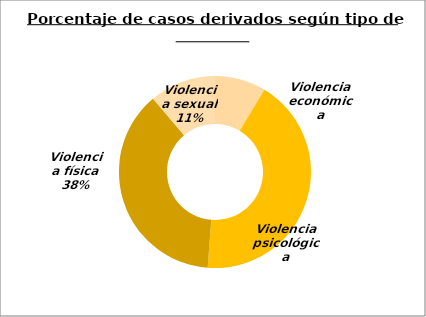
| Category | Series 0 |
|---|---|
| Violencia económica | 81 |
| Violencia psicológica | 401 |
| Violencia física | 354 |
| Violencia sexual | 105 |